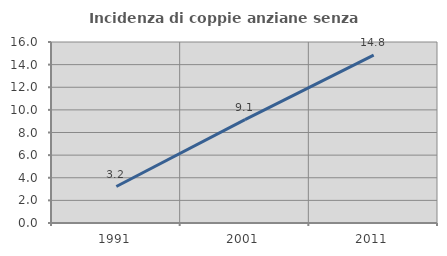
| Category | Incidenza di coppie anziane senza figli  |
|---|---|
| 1991.0 | 3.226 |
| 2001.0 | 9.14 |
| 2011.0 | 14.835 |